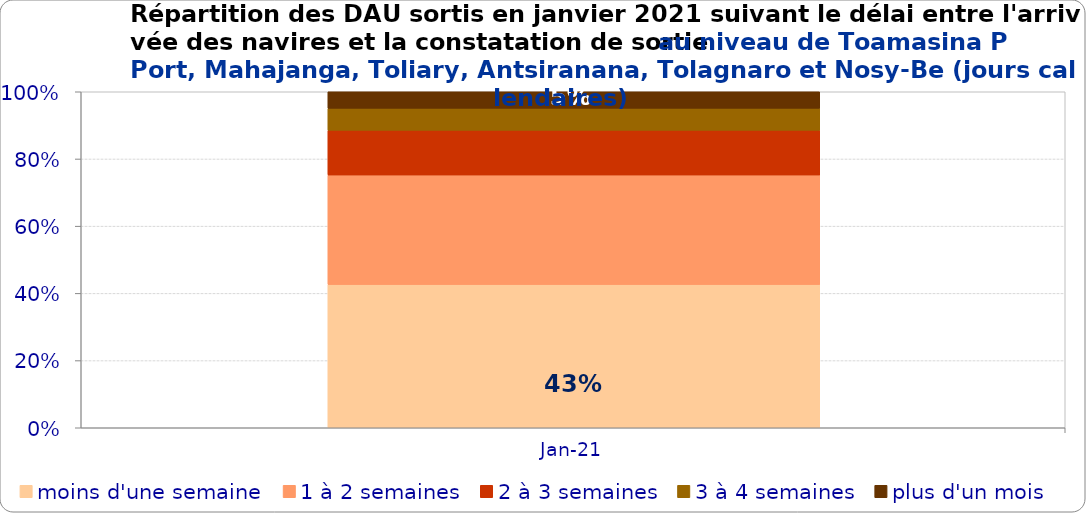
| Category | moins d'une semaine | 1 à 2 semaines | 2 à 3 semaines | 3 à 4 semaines | plus d'un mois |
|---|---|---|---|---|---|
| 2021-01-01 | 0.426 | 0.326 | 0.133 | 0.065 | 0.049 |